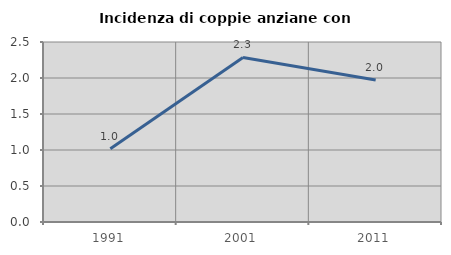
| Category | Incidenza di coppie anziane con figli |
|---|---|
| 1991.0 | 1.017 |
| 2001.0 | 2.285 |
| 2011.0 | 1.971 |